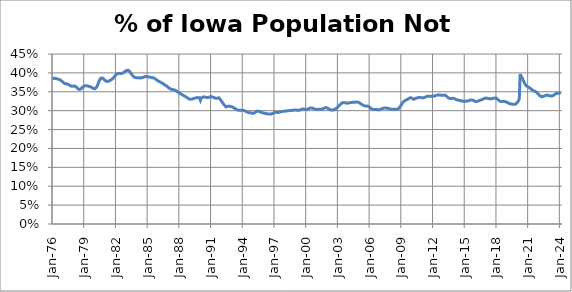
| Category | % of Population Not employed |
|---|---|
| 1976-01-01 | 0.384 |
| 1976-02-01 | 0.385 |
| 1976-03-01 | 0.386 |
| 1976-04-01 | 0.386 |
| 1976-05-01 | 0.385 |
| 1976-06-01 | 0.384 |
| 1976-07-01 | 0.384 |
| 1976-08-01 | 0.383 |
| 1976-09-01 | 0.382 |
| 1976-10-01 | 0.381 |
| 1976-11-01 | 0.379 |
| 1976-12-01 | 0.377 |
| 1977-01-01 | 0.375 |
| 1977-02-01 | 0.373 |
| 1977-03-01 | 0.372 |
| 1977-04-01 | 0.371 |
| 1977-05-01 | 0.371 |
| 1977-06-01 | 0.37 |
| 1977-07-01 | 0.37 |
| 1977-08-01 | 0.368 |
| 1977-09-01 | 0.366 |
| 1977-10-01 | 0.365 |
| 1977-11-01 | 0.365 |
| 1977-12-01 | 0.365 |
| 1978-01-01 | 0.365 |
| 1978-02-01 | 0.366 |
| 1978-03-01 | 0.365 |
| 1978-04-01 | 0.363 |
| 1978-05-01 | 0.36 |
| 1978-06-01 | 0.358 |
| 1978-07-01 | 0.356 |
| 1978-08-01 | 0.356 |
| 1978-09-01 | 0.357 |
| 1978-10-01 | 0.359 |
| 1978-11-01 | 0.362 |
| 1978-12-01 | 0.364 |
| 1979-01-01 | 0.365 |
| 1979-02-01 | 0.366 |
| 1979-03-01 | 0.366 |
| 1979-04-01 | 0.366 |
| 1979-05-01 | 0.365 |
| 1979-06-01 | 0.365 |
| 1979-07-01 | 0.364 |
| 1979-08-01 | 0.363 |
| 1979-09-01 | 0.362 |
| 1979-10-01 | 0.361 |
| 1979-11-01 | 0.36 |
| 1979-12-01 | 0.358 |
| 1980-01-01 | 0.358 |
| 1980-02-01 | 0.359 |
| 1980-03-01 | 0.362 |
| 1980-04-01 | 0.366 |
| 1980-05-01 | 0.372 |
| 1980-06-01 | 0.378 |
| 1980-07-01 | 0.383 |
| 1980-08-01 | 0.386 |
| 1980-09-01 | 0.387 |
| 1980-10-01 | 0.386 |
| 1980-11-01 | 0.384 |
| 1980-12-01 | 0.382 |
| 1981-01-01 | 0.379 |
| 1981-02-01 | 0.378 |
| 1981-03-01 | 0.377 |
| 1981-04-01 | 0.377 |
| 1981-05-01 | 0.378 |
| 1981-06-01 | 0.38 |
| 1981-07-01 | 0.381 |
| 1981-08-01 | 0.382 |
| 1981-09-01 | 0.384 |
| 1981-10-01 | 0.386 |
| 1981-11-01 | 0.389 |
| 1981-12-01 | 0.392 |
| 1982-01-01 | 0.395 |
| 1982-02-01 | 0.397 |
| 1982-03-01 | 0.398 |
| 1982-04-01 | 0.399 |
| 1982-05-01 | 0.399 |
| 1982-06-01 | 0.398 |
| 1982-07-01 | 0.398 |
| 1982-08-01 | 0.398 |
| 1982-09-01 | 0.4 |
| 1982-10-01 | 0.401 |
| 1982-11-01 | 0.403 |
| 1982-12-01 | 0.405 |
| 1983-01-01 | 0.406 |
| 1983-02-01 | 0.407 |
| 1983-03-01 | 0.407 |
| 1983-04-01 | 0.405 |
| 1983-05-01 | 0.403 |
| 1983-06-01 | 0.4 |
| 1983-07-01 | 0.396 |
| 1983-08-01 | 0.393 |
| 1983-09-01 | 0.39 |
| 1983-10-01 | 0.388 |
| 1983-11-01 | 0.387 |
| 1983-12-01 | 0.387 |
| 1984-01-01 | 0.387 |
| 1984-02-01 | 0.387 |
| 1984-03-01 | 0.387 |
| 1984-04-01 | 0.387 |
| 1984-05-01 | 0.387 |
| 1984-06-01 | 0.387 |
| 1984-07-01 | 0.388 |
| 1984-08-01 | 0.388 |
| 1984-09-01 | 0.389 |
| 1984-10-01 | 0.39 |
| 1984-11-01 | 0.39 |
| 1984-12-01 | 0.391 |
| 1985-01-01 | 0.39 |
| 1985-02-01 | 0.389 |
| 1985-03-01 | 0.389 |
| 1985-04-01 | 0.388 |
| 1985-05-01 | 0.388 |
| 1985-06-01 | 0.388 |
| 1985-07-01 | 0.387 |
| 1985-08-01 | 0.387 |
| 1985-09-01 | 0.385 |
| 1985-10-01 | 0.384 |
| 1985-11-01 | 0.382 |
| 1985-12-01 | 0.38 |
| 1986-01-01 | 0.379 |
| 1986-02-01 | 0.377 |
| 1986-03-01 | 0.376 |
| 1986-04-01 | 0.375 |
| 1986-05-01 | 0.374 |
| 1986-06-01 | 0.372 |
| 1986-07-01 | 0.371 |
| 1986-08-01 | 0.369 |
| 1986-09-01 | 0.368 |
| 1986-10-01 | 0.366 |
| 1986-11-01 | 0.364 |
| 1986-12-01 | 0.362 |
| 1987-01-01 | 0.36 |
| 1987-02-01 | 0.359 |
| 1987-03-01 | 0.357 |
| 1987-04-01 | 0.357 |
| 1987-05-01 | 0.356 |
| 1987-06-01 | 0.356 |
| 1987-07-01 | 0.355 |
| 1987-08-01 | 0.354 |
| 1987-09-01 | 0.353 |
| 1987-10-01 | 0.352 |
| 1987-11-01 | 0.35 |
| 1987-12-01 | 0.349 |
| 1988-01-01 | 0.347 |
| 1988-02-01 | 0.345 |
| 1988-03-01 | 0.344 |
| 1988-04-01 | 0.342 |
| 1988-05-01 | 0.341 |
| 1988-06-01 | 0.34 |
| 1988-07-01 | 0.339 |
| 1988-08-01 | 0.337 |
| 1988-09-01 | 0.336 |
| 1988-10-01 | 0.334 |
| 1988-11-01 | 0.332 |
| 1988-12-01 | 0.331 |
| 1989-01-01 | 0.33 |
| 1989-02-01 | 0.33 |
| 1989-03-01 | 0.331 |
| 1989-04-01 | 0.331 |
| 1989-05-01 | 0.332 |
| 1989-06-01 | 0.333 |
| 1989-07-01 | 0.333 |
| 1989-08-01 | 0.334 |
| 1989-09-01 | 0.334 |
| 1989-10-01 | 0.335 |
| 1989-11-01 | 0.334 |
| 1989-12-01 | 0.334 |
| 1990-01-01 | 0.328 |
| 1990-02-01 | 0.334 |
| 1990-03-01 | 0.336 |
| 1990-04-01 | 0.336 |
| 1990-05-01 | 0.337 |
| 1990-06-01 | 0.336 |
| 1990-07-01 | 0.336 |
| 1990-08-01 | 0.335 |
| 1990-09-01 | 0.335 |
| 1990-10-01 | 0.335 |
| 1990-11-01 | 0.336 |
| 1990-12-01 | 0.337 |
| 1991-01-01 | 0.337 |
| 1991-02-01 | 0.337 |
| 1991-03-01 | 0.336 |
| 1991-04-01 | 0.335 |
| 1991-05-01 | 0.334 |
| 1991-06-01 | 0.333 |
| 1991-07-01 | 0.332 |
| 1991-08-01 | 0.333 |
| 1991-09-01 | 0.333 |
| 1991-10-01 | 0.334 |
| 1991-11-01 | 0.331 |
| 1991-12-01 | 0.328 |
| 1992-01-01 | 0.325 |
| 1992-02-01 | 0.322 |
| 1992-03-01 | 0.318 |
| 1992-04-01 | 0.315 |
| 1992-05-01 | 0.314 |
| 1992-06-01 | 0.31 |
| 1992-07-01 | 0.311 |
| 1992-08-01 | 0.312 |
| 1992-09-01 | 0.312 |
| 1992-10-01 | 0.312 |
| 1992-11-01 | 0.311 |
| 1992-12-01 | 0.311 |
| 1993-01-01 | 0.31 |
| 1993-02-01 | 0.309 |
| 1993-03-01 | 0.308 |
| 1993-04-01 | 0.306 |
| 1993-05-01 | 0.305 |
| 1993-06-01 | 0.303 |
| 1993-07-01 | 0.302 |
| 1993-08-01 | 0.301 |
| 1993-09-01 | 0.301 |
| 1993-10-01 | 0.301 |
| 1993-11-01 | 0.301 |
| 1993-12-01 | 0.301 |
| 1994-01-01 | 0.301 |
| 1994-02-01 | 0.301 |
| 1994-03-01 | 0.3 |
| 1994-04-01 | 0.299 |
| 1994-05-01 | 0.298 |
| 1994-06-01 | 0.296 |
| 1994-07-01 | 0.295 |
| 1994-08-01 | 0.295 |
| 1994-09-01 | 0.295 |
| 1994-10-01 | 0.294 |
| 1994-11-01 | 0.294 |
| 1994-12-01 | 0.293 |
| 1995-01-01 | 0.293 |
| 1995-02-01 | 0.293 |
| 1995-03-01 | 0.295 |
| 1995-04-01 | 0.297 |
| 1995-05-01 | 0.298 |
| 1995-06-01 | 0.299 |
| 1995-07-01 | 0.299 |
| 1995-08-01 | 0.298 |
| 1995-09-01 | 0.297 |
| 1995-10-01 | 0.295 |
| 1995-11-01 | 0.295 |
| 1995-12-01 | 0.294 |
| 1996-01-01 | 0.294 |
| 1996-02-01 | 0.293 |
| 1996-03-01 | 0.292 |
| 1996-04-01 | 0.292 |
| 1996-05-01 | 0.292 |
| 1996-06-01 | 0.291 |
| 1996-07-01 | 0.291 |
| 1996-08-01 | 0.291 |
| 1996-09-01 | 0.291 |
| 1996-10-01 | 0.292 |
| 1996-11-01 | 0.293 |
| 1996-12-01 | 0.294 |
| 1997-01-01 | 0.295 |
| 1997-02-01 | 0.296 |
| 1997-03-01 | 0.296 |
| 1997-04-01 | 0.295 |
| 1997-05-01 | 0.295 |
| 1997-06-01 | 0.295 |
| 1997-07-01 | 0.296 |
| 1997-08-01 | 0.297 |
| 1997-09-01 | 0.298 |
| 1997-10-01 | 0.298 |
| 1997-11-01 | 0.298 |
| 1997-12-01 | 0.298 |
| 1998-01-01 | 0.299 |
| 1998-02-01 | 0.299 |
| 1998-03-01 | 0.299 |
| 1998-04-01 | 0.3 |
| 1998-05-01 | 0.3 |
| 1998-06-01 | 0.3 |
| 1998-07-01 | 0.301 |
| 1998-08-01 | 0.3 |
| 1998-09-01 | 0.301 |
| 1998-10-01 | 0.301 |
| 1998-11-01 | 0.301 |
| 1998-12-01 | 0.302 |
| 1999-01-01 | 0.302 |
| 1999-02-01 | 0.301 |
| 1999-03-01 | 0.301 |
| 1999-04-01 | 0.301 |
| 1999-05-01 | 0.301 |
| 1999-06-01 | 0.301 |
| 1999-07-01 | 0.303 |
| 1999-08-01 | 0.304 |
| 1999-09-01 | 0.304 |
| 1999-10-01 | 0.305 |
| 1999-11-01 | 0.304 |
| 1999-12-01 | 0.304 |
| 2000-01-01 | 0.303 |
| 2000-02-01 | 0.303 |
| 2000-03-01 | 0.304 |
| 2000-04-01 | 0.305 |
| 2000-05-01 | 0.306 |
| 2000-06-01 | 0.307 |
| 2000-07-01 | 0.307 |
| 2000-08-01 | 0.307 |
| 2000-09-01 | 0.306 |
| 2000-10-01 | 0.305 |
| 2000-11-01 | 0.304 |
| 2000-12-01 | 0.304 |
| 2001-01-01 | 0.303 |
| 2001-02-01 | 0.303 |
| 2001-03-01 | 0.303 |
| 2001-04-01 | 0.304 |
| 2001-05-01 | 0.304 |
| 2001-06-01 | 0.304 |
| 2001-07-01 | 0.304 |
| 2001-08-01 | 0.305 |
| 2001-09-01 | 0.306 |
| 2001-10-01 | 0.307 |
| 2001-11-01 | 0.308 |
| 2001-12-01 | 0.308 |
| 2002-01-01 | 0.307 |
| 2002-02-01 | 0.306 |
| 2002-03-01 | 0.304 |
| 2002-04-01 | 0.303 |
| 2002-05-01 | 0.302 |
| 2002-06-01 | 0.301 |
| 2002-07-01 | 0.301 |
| 2002-08-01 | 0.302 |
| 2002-09-01 | 0.303 |
| 2002-10-01 | 0.304 |
| 2002-11-01 | 0.306 |
| 2002-12-01 | 0.308 |
| 2003-01-01 | 0.31 |
| 2003-02-01 | 0.312 |
| 2003-03-01 | 0.315 |
| 2003-04-01 | 0.317 |
| 2003-05-01 | 0.319 |
| 2003-06-01 | 0.321 |
| 2003-07-01 | 0.322 |
| 2003-08-01 | 0.322 |
| 2003-09-01 | 0.321 |
| 2003-10-01 | 0.32 |
| 2003-11-01 | 0.32 |
| 2003-12-01 | 0.32 |
| 2004-01-01 | 0.32 |
| 2004-02-01 | 0.321 |
| 2004-03-01 | 0.321 |
| 2004-04-01 | 0.322 |
| 2004-05-01 | 0.322 |
| 2004-06-01 | 0.322 |
| 2004-07-01 | 0.322 |
| 2004-08-01 | 0.322 |
| 2004-09-01 | 0.323 |
| 2004-10-01 | 0.323 |
| 2004-11-01 | 0.323 |
| 2004-12-01 | 0.322 |
| 2005-01-01 | 0.321 |
| 2005-02-01 | 0.32 |
| 2005-03-01 | 0.318 |
| 2005-04-01 | 0.317 |
| 2005-05-01 | 0.315 |
| 2005-06-01 | 0.314 |
| 2005-07-01 | 0.313 |
| 2005-08-01 | 0.313 |
| 2005-09-01 | 0.312 |
| 2005-10-01 | 0.313 |
| 2005-11-01 | 0.312 |
| 2005-12-01 | 0.311 |
| 2006-01-01 | 0.309 |
| 2006-02-01 | 0.307 |
| 2006-03-01 | 0.305 |
| 2006-04-01 | 0.304 |
| 2006-05-01 | 0.303 |
| 2006-06-01 | 0.303 |
| 2006-07-01 | 0.303 |
| 2006-08-01 | 0.303 |
| 2006-09-01 | 0.303 |
| 2006-10-01 | 0.302 |
| 2006-11-01 | 0.302 |
| 2006-12-01 | 0.302 |
| 2007-01-01 | 0.303 |
| 2007-02-01 | 0.304 |
| 2007-03-01 | 0.305 |
| 2007-04-01 | 0.306 |
| 2007-05-01 | 0.307 |
| 2007-06-01 | 0.307 |
| 2007-07-01 | 0.307 |
| 2007-08-01 | 0.307 |
| 2007-09-01 | 0.307 |
| 2007-10-01 | 0.306 |
| 2007-11-01 | 0.305 |
| 2007-12-01 | 0.305 |
| 2008-01-01 | 0.304 |
| 2008-02-01 | 0.304 |
| 2008-03-01 | 0.304 |
| 2008-04-01 | 0.304 |
| 2008-05-01 | 0.304 |
| 2008-06-01 | 0.304 |
| 2008-07-01 | 0.304 |
| 2008-08-01 | 0.304 |
| 2008-09-01 | 0.304 |
| 2008-10-01 | 0.306 |
| 2008-11-01 | 0.308 |
| 2008-12-01 | 0.311 |
| 2009-01-01 | 0.315 |
| 2009-02-01 | 0.319 |
| 2009-03-01 | 0.322 |
| 2009-04-01 | 0.325 |
| 2009-05-01 | 0.326 |
| 2009-06-01 | 0.328 |
| 2009-07-01 | 0.329 |
| 2009-08-01 | 0.33 |
| 2009-09-01 | 0.331 |
| 2009-10-01 | 0.333 |
| 2009-11-01 | 0.334 |
| 2009-12-01 | 0.334 |
| 2010-01-01 | 0.334 |
| 2010-02-01 | 0.332 |
| 2010-03-01 | 0.33 |
| 2010-04-01 | 0.333 |
| 2010-05-01 | 0.332 |
| 2010-06-01 | 0.333 |
| 2010-07-01 | 0.334 |
| 2010-08-01 | 0.335 |
| 2010-09-01 | 0.335 |
| 2010-10-01 | 0.335 |
| 2010-11-01 | 0.335 |
| 2010-12-01 | 0.334 |
| 2011-01-01 | 0.334 |
| 2011-02-01 | 0.334 |
| 2011-03-01 | 0.335 |
| 2011-04-01 | 0.335 |
| 2011-05-01 | 0.337 |
| 2011-06-01 | 0.337 |
| 2011-07-01 | 0.338 |
| 2011-08-01 | 0.338 |
| 2011-09-01 | 0.338 |
| 2011-10-01 | 0.338 |
| 2011-11-01 | 0.338 |
| 2011-12-01 | 0.338 |
| 2012-01-01 | 0.338 |
| 2012-02-01 | 0.338 |
| 2012-03-01 | 0.339 |
| 2012-04-01 | 0.34 |
| 2012-05-01 | 0.341 |
| 2012-06-01 | 0.342 |
| 2012-07-01 | 0.342 |
| 2012-08-01 | 0.342 |
| 2012-09-01 | 0.341 |
| 2012-10-01 | 0.341 |
| 2012-11-01 | 0.341 |
| 2012-12-01 | 0.341 |
| 2013-01-01 | 0.341 |
| 2013-02-01 | 0.341 |
| 2013-03-01 | 0.341 |
| 2013-04-01 | 0.339 |
| 2013-05-01 | 0.337 |
| 2013-06-01 | 0.335 |
| 2013-07-01 | 0.333 |
| 2013-08-01 | 0.332 |
| 2013-09-01 | 0.332 |
| 2013-10-01 | 0.332 |
| 2013-11-01 | 0.333 |
| 2013-12-01 | 0.333 |
| 2014-01-01 | 0.332 |
| 2014-02-01 | 0.331 |
| 2014-03-01 | 0.33 |
| 2014-04-01 | 0.329 |
| 2014-05-01 | 0.328 |
| 2014-06-01 | 0.328 |
| 2014-07-01 | 0.327 |
| 2014-08-01 | 0.327 |
| 2014-09-01 | 0.326 |
| 2014-10-01 | 0.325 |
| 2014-11-01 | 0.325 |
| 2014-12-01 | 0.325 |
| 2015-01-01 | 0.325 |
| 2015-02-01 | 0.325 |
| 2015-03-01 | 0.325 |
| 2015-04-01 | 0.325 |
| 2015-05-01 | 0.326 |
| 2015-06-01 | 0.327 |
| 2015-07-01 | 0.328 |
| 2015-08-01 | 0.328 |
| 2015-09-01 | 0.328 |
| 2015-10-01 | 0.328 |
| 2015-11-01 | 0.327 |
| 2015-12-01 | 0.326 |
| 2016-01-01 | 0.324 |
| 2016-02-01 | 0.324 |
| 2016-03-01 | 0.324 |
| 2016-04-01 | 0.325 |
| 2016-05-01 | 0.326 |
| 2016-06-01 | 0.327 |
| 2016-07-01 | 0.328 |
| 2016-08-01 | 0.329 |
| 2016-09-01 | 0.329 |
| 2016-10-01 | 0.331 |
| 2016-11-01 | 0.332 |
| 2016-12-01 | 0.333 |
| 2017-01-01 | 0.333 |
| 2017-02-01 | 0.333 |
| 2017-03-01 | 0.333 |
| 2017-04-01 | 0.332 |
| 2017-05-01 | 0.331 |
| 2017-06-01 | 0.331 |
| 2017-07-01 | 0.331 |
| 2017-08-01 | 0.332 |
| 2017-09-01 | 0.333 |
| 2017-10-01 | 0.333 |
| 2017-11-01 | 0.333 |
| 2017-12-01 | 0.333 |
| 2018-01-01 | 0.333 |
| 2018-02-01 | 0.331 |
| 2018-03-01 | 0.329 |
| 2018-04-01 | 0.327 |
| 2018-05-01 | 0.325 |
| 2018-06-01 | 0.324 |
| 2018-07-01 | 0.324 |
| 2018-08-01 | 0.325 |
| 2018-09-01 | 0.325 |
| 2018-10-01 | 0.325 |
| 2018-11-01 | 0.324 |
| 2018-12-01 | 0.323 |
| 2019-01-01 | 0.322 |
| 2019-02-01 | 0.321 |
| 2019-03-01 | 0.32 |
| 2019-04-01 | 0.319 |
| 2019-05-01 | 0.318 |
| 2019-06-01 | 0.317 |
| 2019-07-01 | 0.317 |
| 2019-08-01 | 0.317 |
| 2019-09-01 | 0.317 |
| 2019-10-01 | 0.317 |
| 2019-11-01 | 0.317 |
| 2019-12-01 | 0.319 |
| 2020-01-01 | 0.322 |
| 2020-02-01 | 0.326 |
| 2020-03-01 | 0.331 |
| 2020-04-01 | 0.397 |
| 2020-05-01 | 0.391 |
| 2020-06-01 | 0.388 |
| 2020-07-01 | 0.383 |
| 2020-08-01 | 0.378 |
| 2020-09-01 | 0.373 |
| 2020-10-01 | 0.369 |
| 2020-11-01 | 0.366 |
| 2020-12-01 | 0.364 |
| 2021-01-01 | 0.363 |
| 2021-02-01 | 0.362 |
| 2021-03-01 | 0.36 |
| 2021-04-01 | 0.358 |
| 2021-05-01 | 0.356 |
| 2021-06-01 | 0.354 |
| 2021-07-01 | 0.353 |
| 2021-08-01 | 0.352 |
| 2021-09-01 | 0.351 |
| 2021-10-01 | 0.35 |
| 2021-11-01 | 0.348 |
| 2021-12-01 | 0.346 |
| 2022-01-01 | 0.343 |
| 2022-02-01 | 0.34 |
| 2022-03-01 | 0.338 |
| 2022-04-01 | 0.337 |
| 2022-05-01 | 0.337 |
| 2022-06-01 | 0.337 |
| 2022-07-01 | 0.338 |
| 2022-08-01 | 0.339 |
| 2022-09-01 | 0.34 |
| 2022-10-01 | 0.341 |
| 2022-11-01 | 0.341 |
| 2022-12-01 | 0.34 |
| 2023-01-01 | 0.34 |
| 2023-02-01 | 0.339 |
| 2023-03-01 | 0.339 |
| 2023-04-01 | 0.339 |
| 2023-05-01 | 0.339 |
| 2023-06-01 | 0.341 |
| 2023-07-01 | 0.342 |
| 2023-08-01 | 0.344 |
| 2023-09-01 | 0.346 |
| 2023-10-01 | 0.346 |
| 2023-11-01 | 0.346 |
| 2023-12-01 | 0.346 |
| 2024-01-01 | 0.347 |
| 2024-02-01 | 0.348 |
| 2024-03-01 | 0.349 |